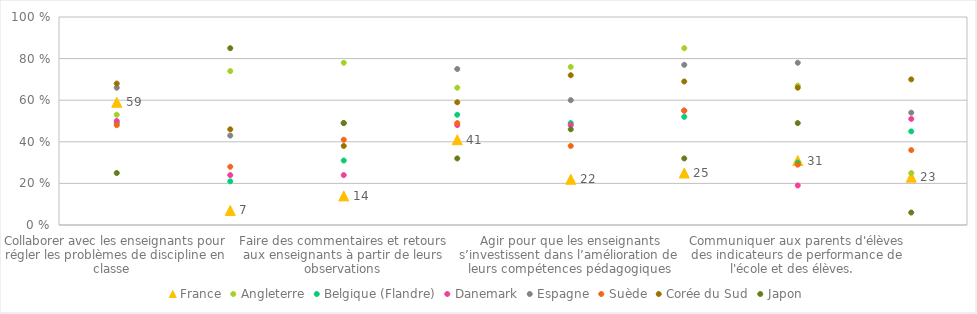
| Category | France | Angleterre | Belgique (Flandre) | Danemark | Espagne | Suède | Corée du Sud | Japon |
|---|---|---|---|---|---|---|---|---|
| Collaborer avec les enseignants pour régler les problèmes de discipline en classe   | 0.59 | 0.53 | 0.49 | 0.5 | 0.66 | 0.48 | 0.68 | 0.25 |
| Observer des cours | 0.07 | 0.74 | 0.21 | 0.24 | 0.43 | 0.28 | 0.46 | 0.85 |
| Faire des commentaires et retours aux enseignants à partir de leurs observations | 0.14 | 0.78 | 0.31 | 0.24 | 0.49 | 0.41 | 0.38 | 0.49 |
| Favoriser la coopération entre enseignants pour élaborer des pratiques pédagogiques innovantes | 0.41 | 0.66 | 0.53 | 0.48 | 0.75 | 0.49 | 0.59 | 0.32 |
| Agir pour que les enseignants s’investissent dans l’amélioration de leurs compétences pédagogiques | 0.22 | 0.76 | 0.49 | 0.48 | 0.6 | 0.38 | 0.72 | 0.46 |
| Agir pour que les enseignants se sentent responsables des résultats de leurs élèves | 0.25 | 0.85 | 0.52 | 0.55 | 0.77 | 0.55 | 0.69 | 0.32 |
| Communiquer aux parents d'élèves des indicateurs de performance de l'école et des élèves.   | 0.31 | 0.67 | 0.3 | 0.19 | 0.78 | 0.29 | 0.66 | 0.49 |
| Résoudre les problèmes d’emplois du temps | 0.23 | 0.25 | 0.45 | 0.51 | 0.54 | 0.36 | 0.7 | 0.06 |